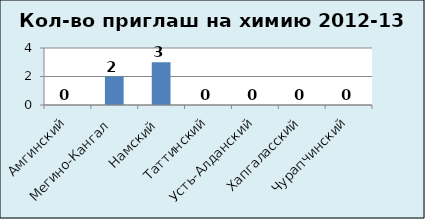
| Category | хим |
|---|---|
| Амгинский | 0 |
| Мегино-Кангал | 2 |
| Намский | 3 |
| Таттинский | 0 |
| Усть-Алданский | 0 |
| Хапгаласский | 0 |
| Чурапчинский | 0 |